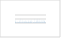
| Category | Итог |
|---|---|
| Агатова Анна Раульевна | 11.5 |
| Агашев Алексей Михайлович | 58.044 |
| Агашева Елена Владимировна | 9.778 |
| Айриянц Евгения Владимировна | 31.286 |
| Арефьев Антон Васильевич | 19.5 |
| Артамонова Светлана Юрьевна | 15.6 |
| Афанасьев Валентин Петрович | 84.092 |
| Ащепков Игорь Викторович | 53.417 |
| Бабич Валерий Васильевич | 12.621 |
| Бабич Юрий Васильевич | 26.667 |
| Бабичев Алексей Владимирович | 16.4 |
| Бадмаева Жомнит Ашоровна | 2.333 |
| Барабаш Екатерина Олеговна | 1.4 |
| Баталева Юлия Владиславна | 7.2 |
| Беккер Татьяна Борисовна | 21 |
| Беляева Татьяна Владимировна | 32.5 |
| Белянин Дмитрий Константинович | 31.298 |
| Бехтенова Алтына Ербаяновна | 19.5 |
| Бобров Владислав Андреевич | 17.343 |
| Богуславский Анатолий Евгеньевич | 3.5 |
| Борздов Юрий Михайлович | 7.2 |
| Боровиков Андрей Александрович | 8 |
| Бородин Андрей Васильевич | 2.333 |
| Бородина Евгения Викторовна | 12 |
| Бородина Ульяна Олеговна | 25.2 |
| Бульбак Тарас Александрович | 19.143 |
| Буслов Михаил Михайлович | 19.65 |
| Васильев Георгий Сергеевич | 7 |
| Васильев Юрий Романович | 2.571 |
| Ветров Евгений Валерьевич | 22.7 |
| Ветрова Наталья Игоревна | 23.5 |
| Вишневский Андрей Владиславович | 20.25 |
| Владимиров Владимир Геннадьевич | 5.275 |
| Волосов Алексей Сергеевич | 3.9 |
| Вольвах Анна Олеговна | 43.1 |
| Вольвах Николай Евгеньевич | 35.6 |
| Восель Юлия Сергеевна | 3.167 |
| Гаврюшкин Павел Николаевич | 67.659 |
| Гаськов Иван Васильевич | 18 |
| Гаськова Ольга Лукинична | 8.367 |
| Гибшер Надежда Александровна | 30 |
| Гладков Игорь Николаевич | 20.25 |
| Голованов Семен Евгеньевич | 3 |
| Головин Александр Викторович | 109.825 |
| Голошумова Алина Александровна | 18.917 |
| Гора Марина Павловна | 1.714 |
| Гореявчева Анастасия Александровна | 9.692 |
| Горяйнов Сергей Владимирович | 44.7 |
| Гришина Светлана Николаевна | 19.5 |
| Губанов Николай Васильевич | 1.458 |
| Гудимова Алёна Ивановна | 9.778 |
| Гурова Александра Владимировна | 2.057 |
| Густайтис Мария Алексеевна | 27.217 |
| Дарьин Андрей Викторович | 2 |
| Девятиярова Анна Сергеевна | 10.75 |
| Дистанов Валерий Элимирович | 20.25 |
| Дорошкевич Анна Геннадьевна | 35.262 |
| Дребущак Валерий Анатольевич | 1.714 |
| Елисеев Александр Павлович | 32.167 |
| Жданова Анастасия Николаевна | 15.835 |
| Жимулев Егор Игоревич | 89.025 |
| Жимулев Федор Игоревич | 23.7 |
| Житова Людмила Михайловна | 5.714 |
| Жмодик Сергей Михайлович | 51.14 |
| Заякина Светлана Борисовна | 2 |
| Здроков Евгений Владимирович | 7.2 |
| Здрокова Марина Сергеевна | 5.75 |
| Зиновьев Сергей Валентинович | 6 |
| Зольников Иван Дмитриевич | 30 |
| Зубакова Елизавета Анатольевна | 0.75 |
| Зыкин Владимир Сергеевич | 47.75 |
| Зыкина Валентина Семеновна | 34.1 |
| Иванов Александр Владимирович | 7.2 |
| Иванова Оксана Александровна | 10.067 |
| Избродин Иван Александрович | 23.125 |
| Изох Андрей Эмильевич | 33.262 |
| Ильин Андрей Александрович | 6 |
| Ильина Ольга Владимировна | 7.2 |
| Ильичева Екатерина Александровна | 3.9 |
| Имомназаров Шерзад Холматжонович | 10 |
| Инербаев Талгат Муратович | 36.75 |
| Исаенко Людмила Ивановна | 34.381 |
| Калинин Юрий Александрович | 71.4 |
| Калугин Валерий Михайлович | 3.214 |
| Калугин Иван Александрович | 14.371 |
| Карманов Николай Семёнович | 53.1 |
| Кармышева Ирина Владимировна | 5.675 |
| Карпович Захар Алексеевич | 26.625 |
| Картозия Андрей Акакиевич | 20.367 |
| Кирдяшкин Алексей Анатольевич | 27.167 |
| Кирдяшкин Анатолий Григорьевич | 36.833 |
| Кириченко Иван Сергеевич | 11.8 |
| Киселева Валентина Юрьевна | 6 |
| Киселева Ольга Николаевна | 31.286 |
| Колесниченко Мария Владимировна | 6 |
| Колпаков Владислав Владимирович | 5.333 |
| Кононова Надежда Георгиевна | 25.442 |
| Коржнева Ксения Евгеньевна | 7 |
| Королюк Владимир Николаевич | 18.45 |
| Корсаков Андрей Викторович | 61.717 |
| Котлер Павел Дмитриевич | 33.371 |
| Котляров Алексей Васильевич | 12.438 |
| Кох Александр Егорович | 25.442 |
| Кох Константин Александрович | 63.315 |
| Кох Светлана Николаевна | 22.25 |
| Кравченко Анна Александровна | 4 |
| Кривоногов Сергей Константинович | 12.318 |
| Криницын Павел Геннадьевич | 1.714 |
| Кропачева Марья Юрьевна | 13.167 |
| Крук Алексей Николаевич | 18 |
| Крук Михаил Николаевич | 16 |
| Крылов Александр Александрович | 7.2 |
| Кузнецов Артем Борисович | 30.031 |
| Кузьмин Дмитрий Владимирович | 35.143 |
| Кузьмин Ярослав Всеволодович | 66.5 |
| Куйбида Максим Леонидович | 2.4 |
| Куликова Анна Викторовна | 40.65 |
| Курусь Алексей Федорович | 17 |
| Лаврентьев Юрий Григорьевич | 15 |
| Лавренчук Андрей Всеволодович | 10.438 |
| Лазарева Елена Владимировна | 39.047 |
| Леонова Галина Александровна | 48.01 |
| Летникова Елена Феликсовна | 14.2 |
| Лиханов Игорь Иванович | 82 |
| Лихачева Анна Юрьевна | 6.5 |
| Лобанов Сергей Иванович | 18.798 |
| Логвинова Алла Михайловна | 42.6 |
| Макарова Ирина Владимировна | 6 |
| Маликов Дмитрий Геннадьевич | 38.6 |
| Маликова Екатерина Леонидовна | 7 |
| Маликова Ирина Николаевна | 6 |
| Малов Виктор Игоревич | 1.75 |
| Малов Георгий Игоревич | 14.083 |
| Малыгина Елена Вениаминовна | 2.178 |
| Мальцев Антон Евгеньевич | 45.676 |
| Малютина Александра Владиславовна | 1.4 |
| Маркович Татьяна Ивановна | 1.167 |
| Машковцев Рудольф Иванович | 26 |
| Медведь Ирина Викторовна | 15.75 |
| Мезина Ксения Александровна | 14.31 |
| Мельгунов Михаил Сергеевич | 27.31 |
| Мирошниченко Леонид Валерьевич | 8.4 |
| Михайленко Денис Сергеевич | 13.272 |
| Мороз Татьяна Николаевна | 18.143 |
| Муравьева Елена Андреевна | 2 |
| Мягкая Ирина Николаевна | 34.45 |
| Нарара Брайан Папиванаше | 11.143 |
| Неволько Петр Александрович | 106.483 |
| Некипелова Анна Владиславовна | 17.5 |
| Непогодина Юлия Михайловна | 2.333 |
| Непоп Роман Кириллович | 11.5 |
| Низаметдинов Ильдар Рафитович | 11.321 |
| Николаева Ирина Викторовна | 4 |
| Новиков Игорь Станиславович | 19.2 |
| Ножкин Александр Дмитриевич | 12.2 |
| Нугуманова Язгуль Наилевна | 20 |
| Овдина Екатерина Андреевна | 14.083 |
| Овчинников Иван Юрьевич | 32 |
| Овчинников Юрий Иванович | 8.667 |
| Палесский Станислав Владиславович | 4 |
| Пальянов Юрий Николаевич | 28.2 |
| Пальянова Галина Александровна | 86 |
| Панина Лия Ивановна | 12 |
| Перфилова Алина Александровна | 46.2 |
| Подугольникова Екатерина Евгеньевна | 2.917 |
| Полянский Олег Петрович | 28.4 |
| Пономарчук Антон Викторович | 29.929 |
| Пономарчук Виктор Антонович | 2 |
| Похиленко Людмила Николаевна | 12.6 |
| Похиленко Николай Петрович | 106.803 |
| Прокопьев Илья Романович | 18.45 |
| Рагозин Алексей Львович | 56.7 |
| Ращенко Сергей Владимирович | 9.312 |
| Ревердатто Владимир Викторович | 55.2 |
| Редин Юрий Олегович | 4.75 |
| Редина Анна Андреевна | 5.625 |
| Резвухин Дмитрий Иванович | 7.5 |
| Реутский Вадим Николаевич | 60.45 |
| Рокосова Елена Юрьевна | 12 |
| Романенко Александр Владимирович | 6.5 |
| Рубанов Максим Викторович | 15.143 |
| Руднев Сергей Николаевич | 15.6 |
| Рябов Виктор Владимирович | 36 |
| Рябуха Мария Алексеевна | 12 |
| Сагатов Нурсултан  | 12.505 |
| Сагатова Динара | 2.812 |
| Сарыг-оол Багай-оол Юрьевич | 27.45 |
| Сафонова Инна Юрьевна | 46.879 |
| Светлицкая Татьяна Владимировна | 106.55 |
| Селятицкий Александр Юрьевич | 30 |
| Семенов Александр Николаевич | 16.4 |
| Семенова Дина Валерьевна | 54.6 |
| Семерикова Анна Ивановна | 9.312 |
| Серебрянников Алексей Олегович | 2.333 |
| Сереткин Юрий Владимирович | 30.3 |
| Симонов Владимир Александрович | 3.492 |
| Синякова Елена Федоровна | 25.6 |
| Смирнов Сергей Захарович | 16.893 |
| Сокол Александр Григорьевич | 18 |
| Сокол Эллина Владимировна | 59.65 |
| Соловьев Константин Андреевич | 9 |
| Солотчин Павел Анатольевич | 16.835 |
| Солотчина Эмилия Павловна | 6.143 |
| Сонин Валерий Михайлович | 63.692 |
| Софронова София Михайловна | 1.75 |
| Страховенко Вера Дмитриевна | 14.083 |
| Сухоруков Василий Петрович | 24.5 |
| Тарасов Алексей Андреевич | 2 |
| Тарасова Александра Юрьевна | 14.083 |
| Тимина Татьяна Юрьевна | 15.75 |
| Толстых Надежда Дмитриевна | 44.6 |
| Томиленко Анатолий Алексеевич | 21.143 |
| Травин Алексей Валентинович | 69.129 |
| Туркина Ольга Михайловна | 68.838 |
| Тычков Николай Сергеевич | 2.4 |
| Уракаев Фарит Хисамутдинович | 8.584 |
| Фоминых Павел Андреевич | 25.883 |
| Фурман Ольга Владимировна | 7.2 |
| Хромых Сергей Владимирович | 68.443 |
| Хусаинова Альфия Шамилевна | 7.2 |
| Чеботарев Дмитрий Александрович | 21 |
| Чепуров Алексей Анатольевич | 59.025 |
| Чепуров Анатолий Ильич | 55.025 |
| Чугуевский Алексей Викторович | 4 |
| Шавекин Алексей Сергеевич | 19.857 |
| Шарыгин Виктор Викторович | 61 |
| Шацкий Антон Фарисович | 48.5 |
| Шацкий Владислав Станиславович | 40.212 |
| Шевко Артем Яковлевич | 1.714 |
| Шевченко Вячеслав Сергеевич | 25.442 |
| Шелепаев Роман Аркадиевич | 19.65 |
| Шелепов Ярослав Юрьевич | 8.438 |
| Шемелина Ольга Владимировна | 0.875 |
| Широносова Галина Петровна | 18 |
| Юдин Денис Сергеевич | 14.893 |
| Яковлев Владислав Александрович | 4.8 |